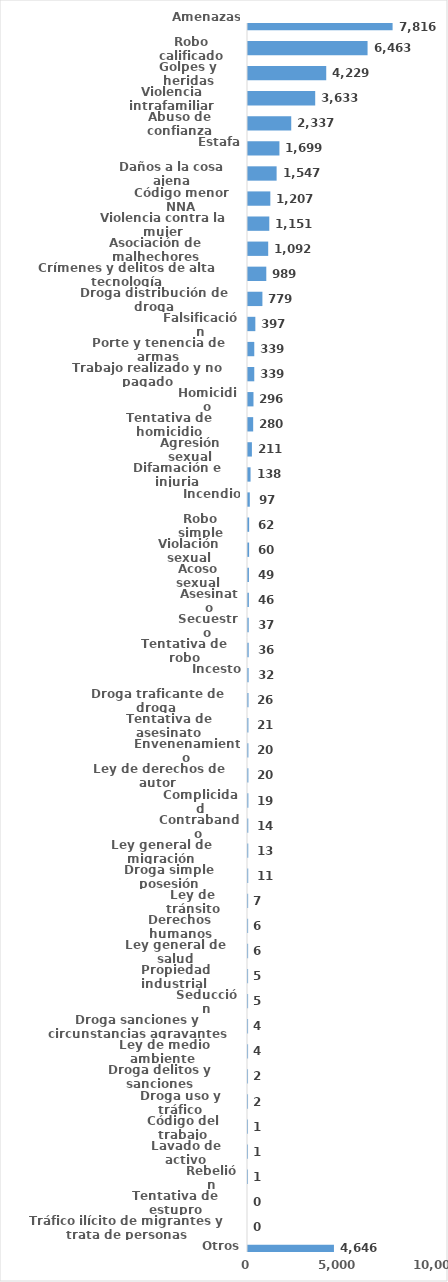
| Category | Series 0 |
|---|---|
| Amenazas | 7816 |
| Robo calificado | 6463 |
| Golpes y heridas | 4229 |
| Violencia intrafamiliar | 3633 |
| Abuso de confianza | 2337 |
| Estafa | 1699 |
| Daños a la cosa ajena | 1547 |
| Código menor NNA | 1207 |
| Violencia contra la mujer | 1151 |
| Asociación de malhechores | 1092 |
| Crímenes y delitos de alta tecnología | 989 |
| Droga distribución de droga | 779 |
| Falsificación | 397 |
| Porte y tenencia de armas | 339 |
| Trabajo realizado y no pagado | 339 |
| Homicidio | 296 |
| Tentativa de homicidio | 280 |
| Agresión sexual | 211 |
| Difamación e injuria | 138 |
| Incendio | 97 |
| Robo simple | 62 |
| Violación sexual | 60 |
| Acoso sexual | 49 |
| Asesinato | 46 |
| Secuestro | 37 |
| Tentativa de robo | 36 |
| Incesto | 32 |
| Droga traficante de droga  | 26 |
| Tentativa de asesinato | 21 |
| Envenenamiento | 20 |
| Ley de derechos de autor  | 20 |
| Complicidad | 19 |
| Contrabando | 14 |
| Ley general de migración | 13 |
| Droga simple posesión | 11 |
| Ley de tránsito | 7 |
| Derechos humanos | 6 |
| Ley general de salud | 6 |
| Propiedad industrial  | 5 |
| Seducción | 5 |
| Droga sanciones y circunstancias agravantes | 4 |
| Ley de medio ambiente  | 4 |
| Droga delitos y sanciones | 2 |
| Droga uso y tráfico | 2 |
| Código del trabajo | 1 |
| Lavado de activo | 1 |
| Rebelión | 1 |
| Tentativa de estupro | 0 |
| Tráfico ilícito de migrantes y trata de personas | 0 |
| Otros | 4646 |